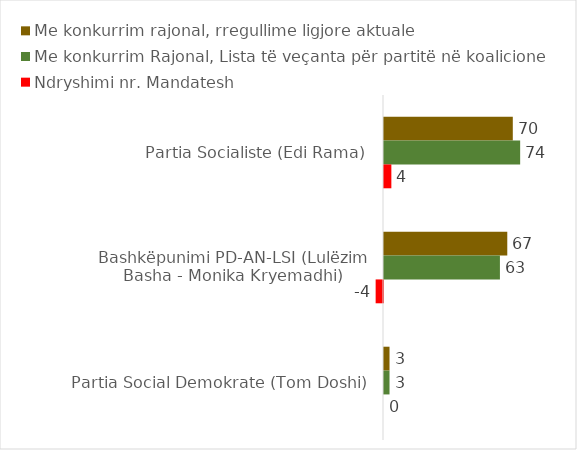
| Category | Me konkurrim rajonal, rregullime ligjore aktuale | Me konkurrim Rajonal, Lista të veçanta për partitë në koalicione | Ndryshimi nr. Mandatesh |
|---|---|---|---|
| Partia Socialiste (Edi Rama) | 70 | 74 | 4 |
| Bashkëpunimi PD-AN-LSI (Lulëzim Basha - Monika Kryemadhi) | 67 | 63 | -4 |
| Partia Social Demokrate (Tom Doshi) | 3 | 3 | 0 |